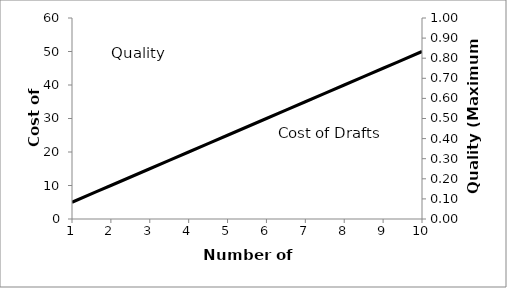
| Category | Series 1 |
|---|---|
| 1.0 | 5 |
| 2.0 | 10 |
| 3.0 | 15 |
| 4.0 | 20 |
| 5.0 | 25 |
| 6.0 | 30 |
| 7.0 | 35 |
| 8.0 | 40 |
| 9.0 | 45 |
| 10.0 | 50 |